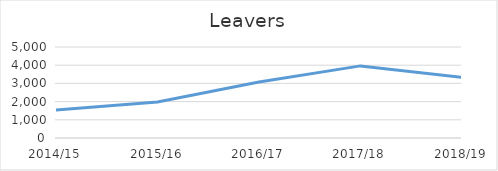
| Category | Leavers |
|---|---|
| 2014/15 | 1545 |
| 2015/16 | 1981 |
| 2016/17 | 3081 |
| 2017/18 | 3962 |
| 2018/19 | 3333 |